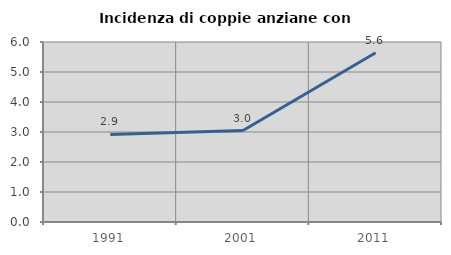
| Category | Incidenza di coppie anziane con figli |
|---|---|
| 1991.0 | 2.919 |
| 2001.0 | 3.048 |
| 2011.0 | 5.644 |